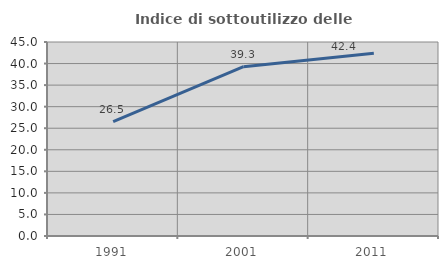
| Category | Indice di sottoutilizzo delle abitazioni  |
|---|---|
| 1991.0 | 26.508 |
| 2001.0 | 39.286 |
| 2011.0 | 42.373 |